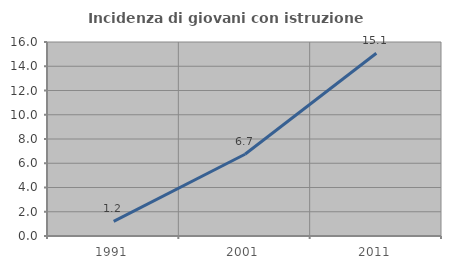
| Category | Incidenza di giovani con istruzione universitaria |
|---|---|
| 1991.0 | 1.205 |
| 2001.0 | 6.742 |
| 2011.0 | 15.068 |